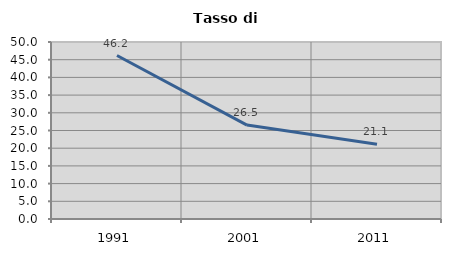
| Category | Tasso di disoccupazione   |
|---|---|
| 1991.0 | 46.18 |
| 2001.0 | 26.535 |
| 2011.0 | 21.117 |